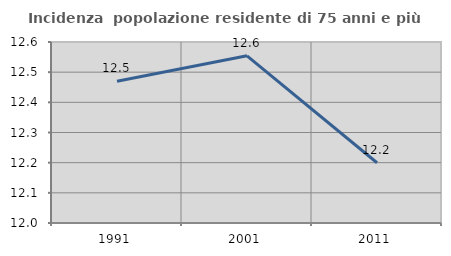
| Category | Incidenza  popolazione residente di 75 anni e più |
|---|---|
| 1991.0 | 12.47 |
| 2001.0 | 12.554 |
| 2011.0 | 12.2 |